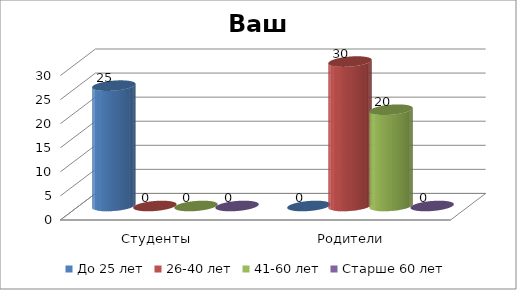
| Category | До 25 лет | 26-40 лет | 41-60 лет | Старше 60 лет |
|---|---|---|---|---|
| Студенты | 25 | 0 | 0 | 0 |
| Родители | 0 | 30 | 20 | 0 |